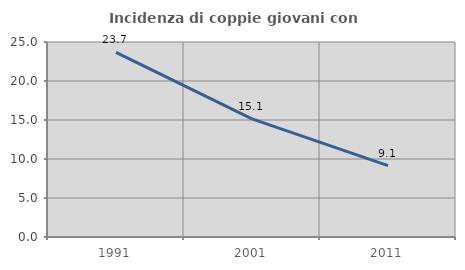
| Category | Incidenza di coppie giovani con figli |
|---|---|
| 1991.0 | 23.679 |
| 2001.0 | 15.147 |
| 2011.0 | 9.142 |